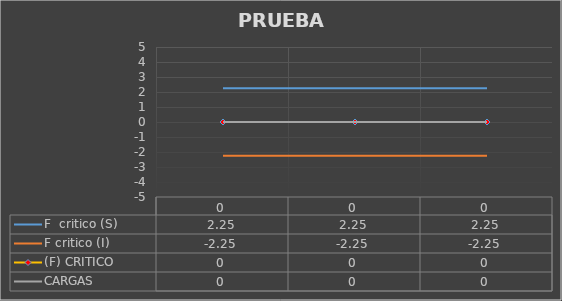
| Category | F  critico (S) | F critico (I) | (F) CRITICO  | CARGAS  |
|---|---|---|---|---|
| 0.0 | 2.25 | -2.25 | 0 | 0 |
| 0.0 | 2.25 | -2.25 | 0 | 0 |
| 0.0 | 2.25 | -2.25 | 0 | 0 |